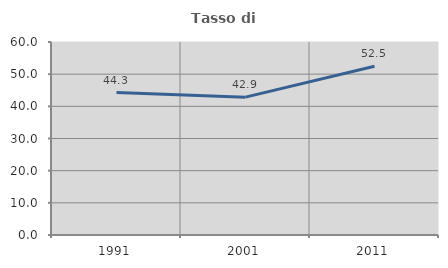
| Category | Tasso di occupazione   |
|---|---|
| 1991.0 | 44.286 |
| 2001.0 | 42.857 |
| 2011.0 | 52.459 |